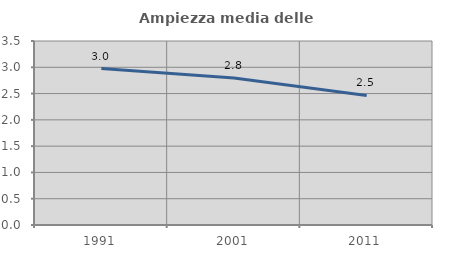
| Category | Ampiezza media delle famiglie |
|---|---|
| 1991.0 | 2.977 |
| 2001.0 | 2.794 |
| 2011.0 | 2.465 |